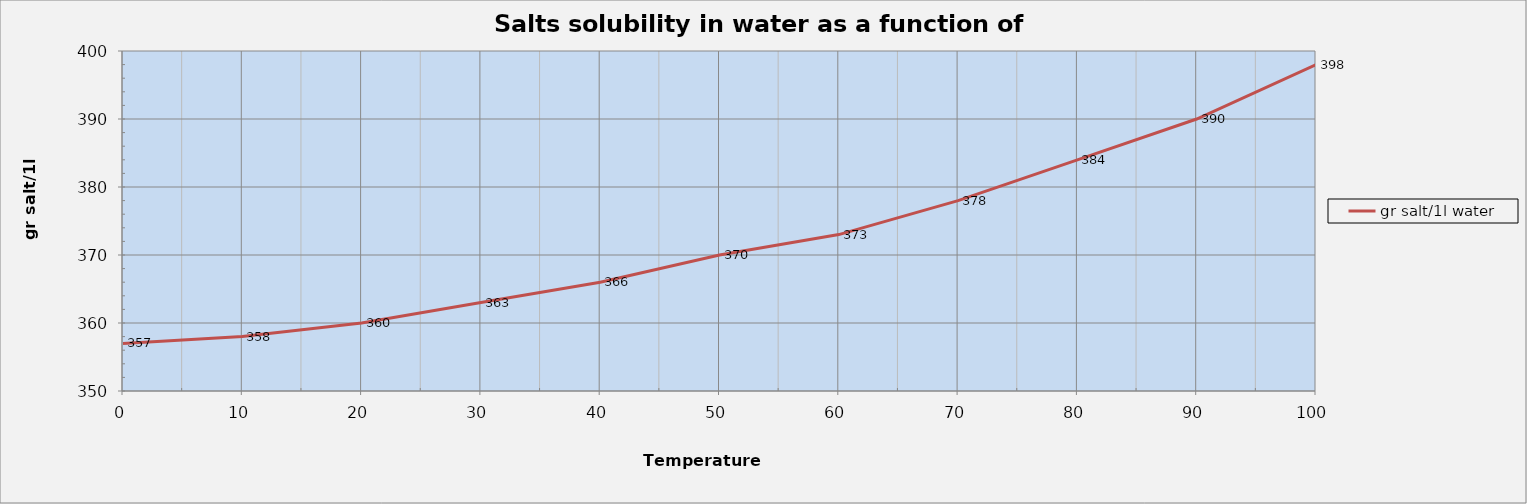
| Category | gr salt/1l water |
|---|---|
| 0.0 | 357 |
| 10.0 | 358 |
| 20.0 | 360 |
| 30.0 | 363 |
| 40.0 | 366 |
| 50.0 | 370 |
| 60.0 | 373 |
| 70.0 | 378 |
| 80.0 | 384 |
| 90.0 | 390 |
| 100.0 | 398 |